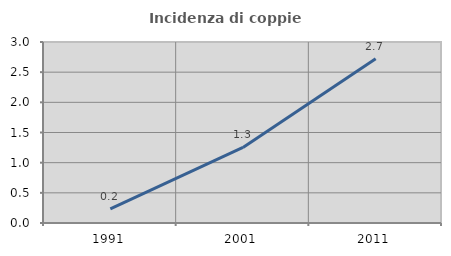
| Category | Incidenza di coppie miste |
|---|---|
| 1991.0 | 0.233 |
| 2001.0 | 1.252 |
| 2011.0 | 2.724 |